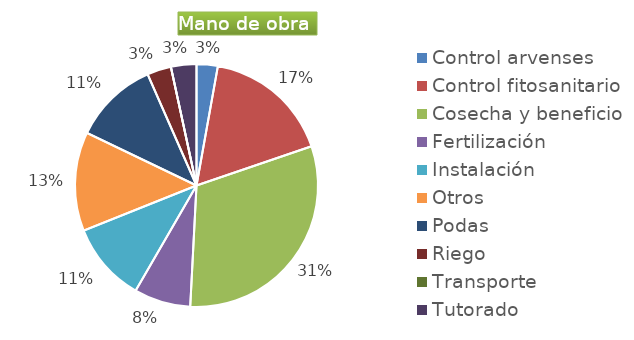
| Category | Series 0 |
|---|---|
| Control arvenses | 986655 |
| Control fitosanitario | 5919930 |
| Cosecha y beneficio | 10853205 |
| Fertilización | 2631080 |
| Instalación | 3699520 |
| Otros | 4604390 |
| Podas | 3946620 |
| Riego | 1118209 |
| Transporte | 0 |
| Tutorado | 1183986 |